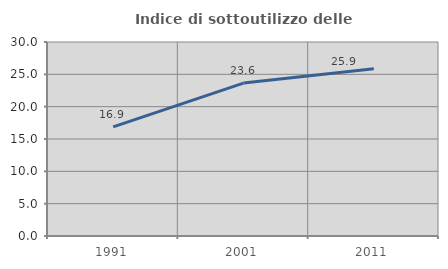
| Category | Indice di sottoutilizzo delle abitazioni  |
|---|---|
| 1991.0 | 16.876 |
| 2001.0 | 23.645 |
| 2011.0 | 25.87 |